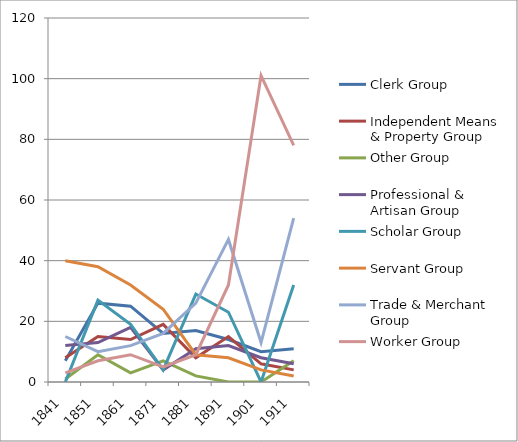
| Category | Clerk Group | Independent Means & Property Group | Other Group | Professional & Artisan Group | Scholar Group | Servant Group | Trade & Merchant Group | Worker Group |
|---|---|---|---|---|---|---|---|---|
| 1841.0 | 7 | 8 | 1 | 12 | 0 | 40 | 15 | 3 |
| 1851.0 | 26 | 15 | 9 | 13 | 27 | 38 | 10 | 7 |
| 1861.0 | 25 | 14 | 3 | 18 | 19 | 32 | 12 | 9 |
| 1871.0 | 16 | 19 | 7 | 4 | 4 | 24 | 16 | 5 |
| 1881.0 | 17 | 8 | 2 | 11 | 29 | 9 | 26 | 9 |
| 1891.0 | 14 | 15 | 0 | 12 | 23 | 8 | 47 | 32 |
| 1901.0 | 10 | 6 | 0 | 8 | 0 | 4 | 13 | 101 |
| 1911.0 | 11 | 4 | 7 | 6 | 32 | 2 | 54 | 78 |